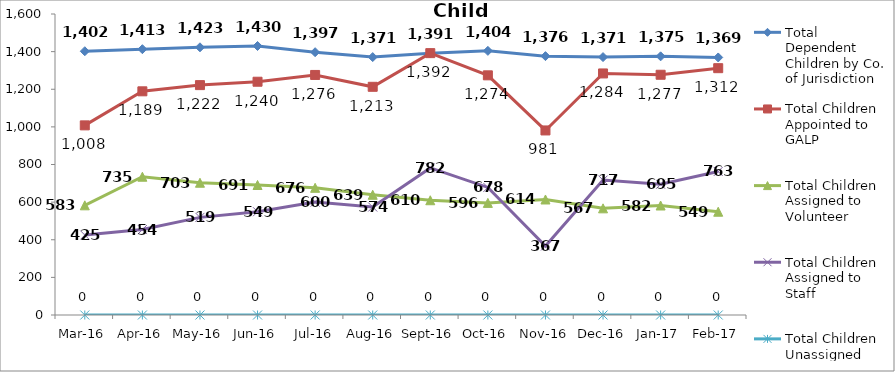
| Category | Total Dependent Children by Co. of Jurisdiction | Total Children Appointed to GALP | Total Children Assigned to Volunteer | Total Children Assigned to Staff | Total Children Unassigned |
|---|---|---|---|---|---|
| Mar-16 | 1402 | 1008 | 583 | 425 | 0 |
| Apr-16 | 1413 | 1189 | 735 | 454 | 0 |
| May-16 | 1423 | 1222 | 703 | 519 | 0 |
| Jun-16 | 1430 | 1240 | 691 | 549 | 0 |
| Jul-16 | 1397 | 1276 | 676 | 600 | 0 |
| Aug-16 | 1371 | 1213 | 639 | 574 | 0 |
| Sep-16 | 1391 | 1392 | 610 | 782 | 0 |
| Oct-16 | 1404 | 1274 | 596 | 678 | 0 |
| Nov-16 | 1376 | 981 | 614 | 367 | 0 |
| Dec-16 | 1371 | 1284 | 567 | 717 | 0 |
| Jan-17 | 1375 | 1277 | 582 | 695 | 0 |
| Feb-17 | 1369 | 1312 | 549 | 763 | 0 |